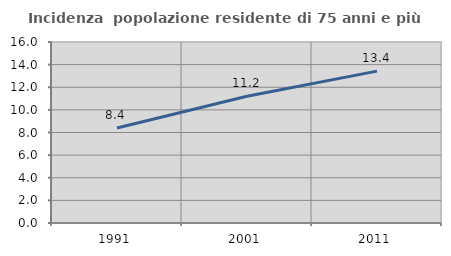
| Category | Incidenza  popolazione residente di 75 anni e più |
|---|---|
| 1991.0 | 8.402 |
| 2001.0 | 11.201 |
| 2011.0 | 13.426 |